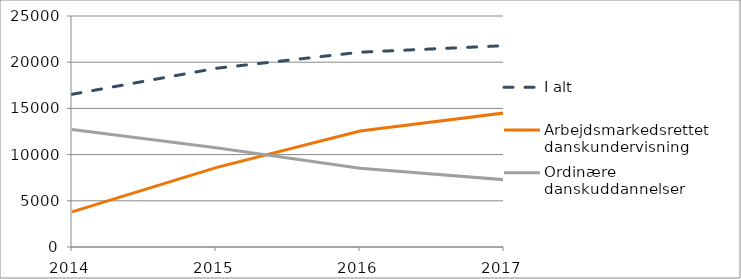
| Category | I alt  | Arbejdsmarkedsrettet danskundervisning   | Ordinære danskuddannelser  |
|---|---|---|---|
| 2014.0 | 16527 | 3804 | 12723 |
| 2015.0 | 19337 | 8595 | 10742 |
| 2016.0 | 21082 | 12549 | 8533 |
| 2017.0 | 21786 | 14503 | 7283 |